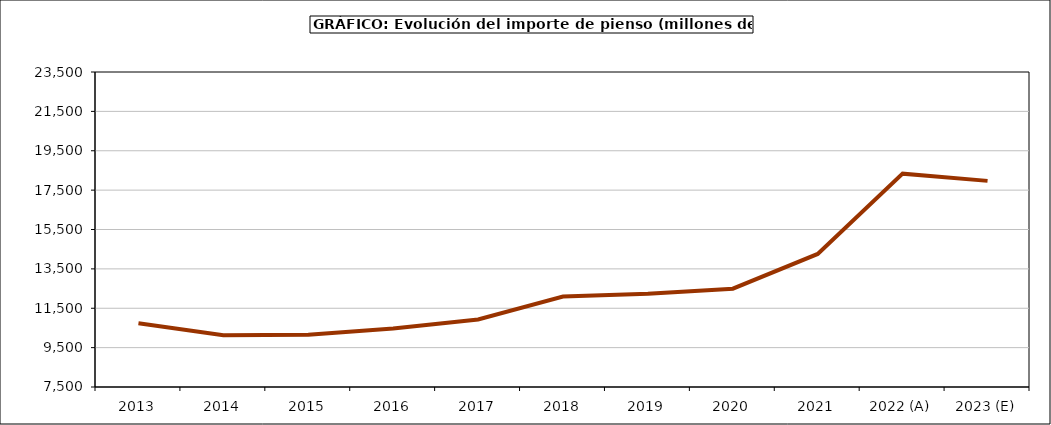
| Category | piensos |
|---|---|
| 2013 | 10733.318 |
| 2014 | 10132.591 |
| 2015 | 10154.98 |
| 2016 | 10470.8 |
| 2017 | 10928.619 |
| 2018 | 12095.55 |
| 2019 | 12231.73 |
| 2020 | 12494.182 |
| 2021 | 14258.103 |
| 2022 (A) | 18336.48 |
| 2023 (E) | 17969.493 |